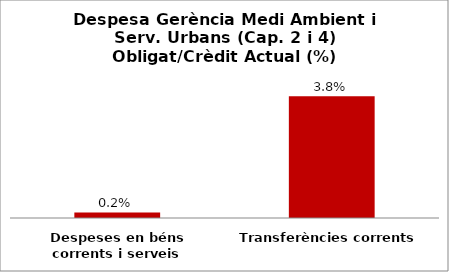
| Category | Series 0 |
|---|---|
| Despeses en béns corrents i serveis | 0.002 |
| Transferències corrents | 0.038 |